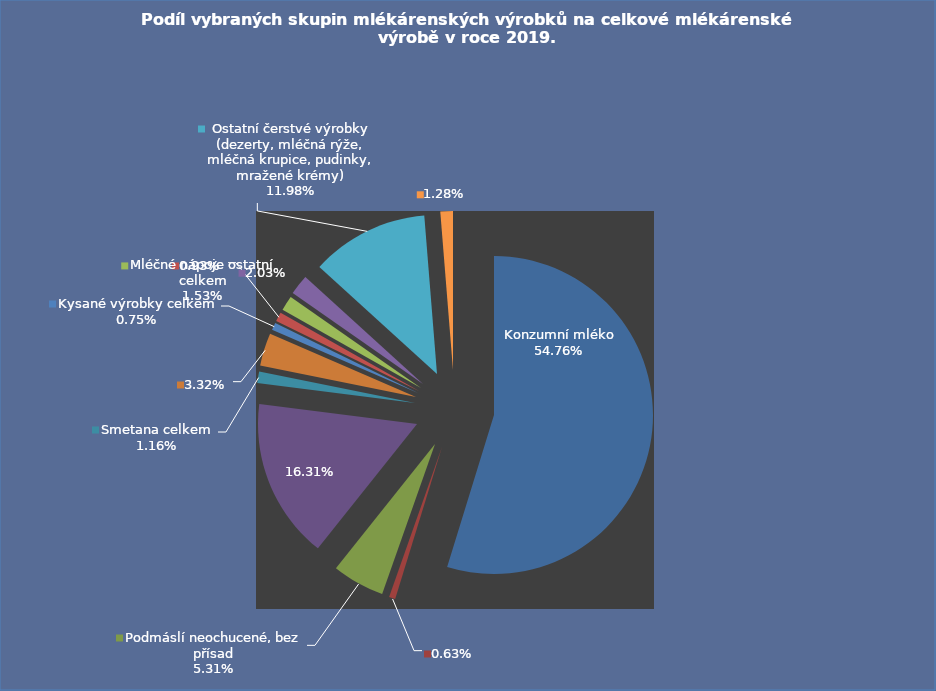
| Category | 2019                       množství (1000 t) |
|---|---|
| Konzumní mléko | 613.97 |
| Podmáslí neochucené, bez přísad | 7.1 |
| Smetana celkem | 59.56 |
| Kysané výrobky celkem | 182.9 |
| Mléčné nápoje ostatní celkem | 13.04 |
| Ostatní čerstvé výrobky (dezerty, mléčná rýže, mléčná krupice, pudinky, mražené krémy) | 37.2 |
| Zahuštěné mléko celkem | 8.41 |
| Sušená smetana, sušené plnotučné mléko, sušené částečně odtučněné mléko | 10.471 |
| Sušené odtučněné mléko | 17.11 |
| Máslo | 22.8 |
| Přírodní sýry z kravského mléka celkem | 134.31 |
| Tavené sýry | 14.31 |